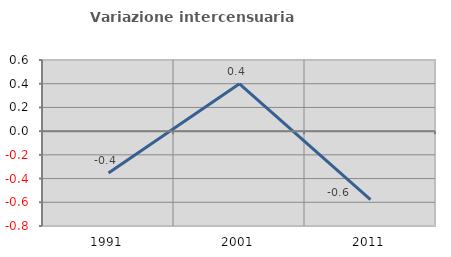
| Category | Variazione intercensuaria annua |
|---|---|
| 1991.0 | -0.354 |
| 2001.0 | 0.399 |
| 2011.0 | -0.578 |